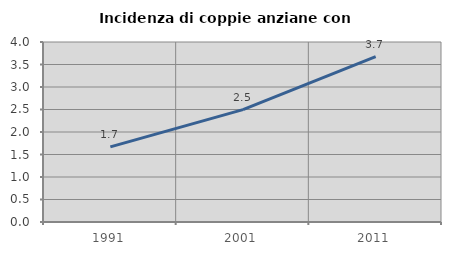
| Category | Incidenza di coppie anziane con figli |
|---|---|
| 1991.0 | 1.67 |
| 2001.0 | 2.497 |
| 2011.0 | 3.674 |